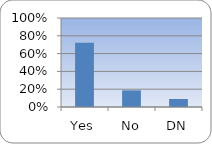
| Category | Series 0 |
|---|---|
| Yes | 0.723 |
| No | 0.187 |
| DN | 0.09 |